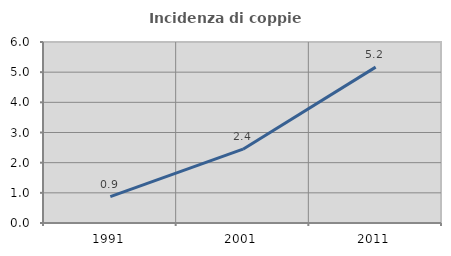
| Category | Incidenza di coppie miste |
|---|---|
| 1991.0 | 0.873 |
| 2001.0 | 2.446 |
| 2011.0 | 5.166 |